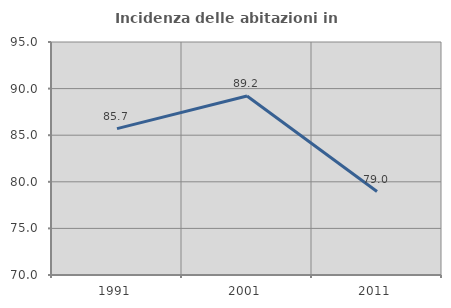
| Category | Incidenza delle abitazioni in proprietà  |
|---|---|
| 1991.0 | 85.702 |
| 2001.0 | 89.202 |
| 2011.0 | 78.953 |